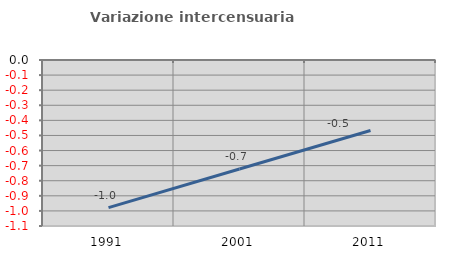
| Category | Variazione intercensuaria annua |
|---|---|
| 1991.0 | -0.979 |
| 2001.0 | -0.722 |
| 2011.0 | -0.467 |